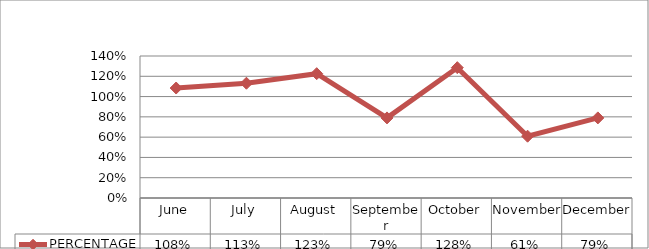
| Category | PERCENTAGE |
|---|---|
| June | 1.084 |
| July | 1.132 |
| August | 1.226 |
| September | 0.79 |
| October | 1.285 |
| November | 0.609 |
| December | 0.79 |